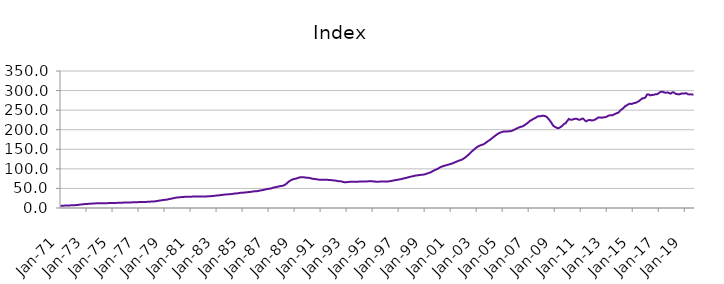
| Category | Index |
|---|---|
| 1971-01-01 | 5.879 |
| 1971-02-01 | 5.921 |
| 1971-03-01 | 5.963 |
| 1971-04-01 | 6.018 |
| 1971-05-01 | 6.108 |
| 1971-06-01 | 6.203 |
| 1971-07-01 | 6.32 |
| 1971-08-01 | 6.446 |
| 1971-09-01 | 6.572 |
| 1971-10-01 | 6.703 |
| 1971-11-01 | 6.844 |
| 1971-12-01 | 7.015 |
| 1972-01-01 | 7.135 |
| 1972-02-01 | 7.213 |
| 1972-03-01 | 7.39 |
| 1972-04-01 | 7.638 |
| 1972-05-01 | 7.997 |
| 1972-06-01 | 8.312 |
| 1972-07-01 | 8.674 |
| 1972-08-01 | 9.023 |
| 1972-09-01 | 9.332 |
| 1972-10-01 | 9.62 |
| 1972-11-01 | 9.887 |
| 1972-12-01 | 10.162 |
| 1973-01-01 | 10.359 |
| 1973-02-01 | 10.498 |
| 1973-03-01 | 10.658 |
| 1973-04-01 | 10.841 |
| 1973-05-01 | 11.075 |
| 1973-06-01 | 11.227 |
| 1973-07-01 | 11.386 |
| 1973-08-01 | 11.562 |
| 1973-09-01 | 11.768 |
| 1973-10-01 | 11.982 |
| 1973-11-01 | 12.145 |
| 1973-12-01 | 12.262 |
| 1974-01-01 | 12.324 |
| 1974-02-01 | 12.392 |
| 1974-03-01 | 12.389 |
| 1974-04-01 | 12.362 |
| 1974-05-01 | 12.339 |
| 1974-06-01 | 12.34 |
| 1974-07-01 | 12.352 |
| 1974-08-01 | 12.392 |
| 1974-09-01 | 12.465 |
| 1974-10-01 | 12.555 |
| 1974-11-01 | 12.63 |
| 1974-12-01 | 12.703 |
| 1975-01-01 | 12.737 |
| 1975-02-01 | 12.78 |
| 1975-03-01 | 12.857 |
| 1975-04-01 | 12.965 |
| 1975-05-01 | 13.097 |
| 1975-06-01 | 13.168 |
| 1975-07-01 | 13.237 |
| 1975-08-01 | 13.332 |
| 1975-09-01 | 13.462 |
| 1975-10-01 | 13.606 |
| 1975-11-01 | 13.732 |
| 1975-12-01 | 13.867 |
| 1976-01-01 | 13.963 |
| 1976-02-01 | 14.052 |
| 1976-03-01 | 14.114 |
| 1976-04-01 | 14.179 |
| 1976-05-01 | 14.264 |
| 1976-06-01 | 14.32 |
| 1976-07-01 | 14.382 |
| 1976-08-01 | 14.474 |
| 1976-09-01 | 14.605 |
| 1976-10-01 | 14.752 |
| 1976-11-01 | 14.87 |
| 1976-12-01 | 14.976 |
| 1977-01-01 | 15.034 |
| 1977-02-01 | 15.102 |
| 1977-03-01 | 15.145 |
| 1977-04-01 | 15.197 |
| 1977-05-01 | 15.276 |
| 1977-06-01 | 15.347 |
| 1977-07-01 | 15.436 |
| 1977-08-01 | 15.557 |
| 1977-09-01 | 15.705 |
| 1977-10-01 | 15.871 |
| 1977-11-01 | 16.048 |
| 1977-12-01 | 16.278 |
| 1978-01-01 | 16.449 |
| 1978-02-01 | 16.582 |
| 1978-03-01 | 16.762 |
| 1978-04-01 | 17.003 |
| 1978-05-01 | 17.391 |
| 1978-06-01 | 17.783 |
| 1978-07-01 | 18.258 |
| 1978-08-01 | 18.744 |
| 1978-09-01 | 19.213 |
| 1978-10-01 | 19.678 |
| 1978-11-01 | 20.113 |
| 1978-12-01 | 20.542 |
| 1979-01-01 | 20.797 |
| 1979-02-01 | 20.968 |
| 1979-03-01 | 21.394 |
| 1979-04-01 | 21.979 |
| 1979-05-01 | 22.725 |
| 1979-06-01 | 23.198 |
| 1979-07-01 | 23.69 |
| 1979-08-01 | 24.243 |
| 1979-09-01 | 24.906 |
| 1979-10-01 | 25.613 |
| 1979-11-01 | 26.202 |
| 1979-12-01 | 26.66 |
| 1980-01-01 | 26.911 |
| 1980-02-01 | 27.107 |
| 1980-03-01 | 27.357 |
| 1980-04-01 | 27.651 |
| 1980-05-01 | 27.994 |
| 1980-06-01 | 28.178 |
| 1980-07-01 | 28.344 |
| 1980-08-01 | 28.498 |
| 1980-09-01 | 28.607 |
| 1980-10-01 | 28.676 |
| 1980-11-01 | 28.73 |
| 1980-12-01 | 28.843 |
| 1981-01-01 | 28.911 |
| 1981-02-01 | 29.013 |
| 1981-03-01 | 29.116 |
| 1981-04-01 | 29.254 |
| 1981-05-01 | 29.394 |
| 1981-06-01 | 29.441 |
| 1981-07-01 | 29.464 |
| 1981-08-01 | 29.469 |
| 1981-09-01 | 29.414 |
| 1981-10-01 | 29.312 |
| 1981-11-01 | 29.219 |
| 1981-12-01 | 29.209 |
| 1982-01-01 | 29.164 |
| 1982-02-01 | 29.184 |
| 1982-03-01 | 29.346 |
| 1982-04-01 | 29.618 |
| 1982-05-01 | 29.924 |
| 1982-06-01 | 30.035 |
| 1982-07-01 | 30.119 |
| 1982-08-01 | 30.28 |
| 1982-09-01 | 30.54 |
| 1982-10-01 | 30.849 |
| 1982-11-01 | 31.157 |
| 1982-12-01 | 31.538 |
| 1983-01-01 | 31.828 |
| 1983-02-01 | 32.078 |
| 1983-03-01 | 32.337 |
| 1983-04-01 | 32.659 |
| 1983-05-01 | 33.081 |
| 1983-06-01 | 33.413 |
| 1983-07-01 | 33.773 |
| 1983-08-01 | 34.116 |
| 1983-09-01 | 34.39 |
| 1983-10-01 | 34.614 |
| 1983-11-01 | 34.826 |
| 1983-12-01 | 35.104 |
| 1984-01-01 | 35.27 |
| 1984-02-01 | 35.438 |
| 1984-03-01 | 35.758 |
| 1984-04-01 | 36.202 |
| 1984-05-01 | 36.71 |
| 1984-06-01 | 36.936 |
| 1984-07-01 | 37.124 |
| 1984-08-01 | 37.411 |
| 1984-09-01 | 37.87 |
| 1984-10-01 | 38.4 |
| 1984-11-01 | 38.81 |
| 1984-12-01 | 39.095 |
| 1985-01-01 | 39.174 |
| 1985-02-01 | 39.283 |
| 1985-03-01 | 39.552 |
| 1985-04-01 | 39.93 |
| 1985-05-01 | 40.361 |
| 1985-06-01 | 40.527 |
| 1985-07-01 | 40.681 |
| 1985-08-01 | 40.948 |
| 1985-09-01 | 41.393 |
| 1985-10-01 | 41.902 |
| 1985-11-01 | 42.329 |
| 1985-12-01 | 42.671 |
| 1986-01-01 | 42.803 |
| 1986-02-01 | 42.939 |
| 1986-03-01 | 43.335 |
| 1986-04-01 | 43.908 |
| 1986-05-01 | 44.624 |
| 1986-06-01 | 45.057 |
| 1986-07-01 | 45.499 |
| 1986-08-01 | 46.028 |
| 1986-09-01 | 46.692 |
| 1986-10-01 | 47.409 |
| 1986-11-01 | 48.06 |
| 1986-12-01 | 48.667 |
| 1987-01-01 | 49.02 |
| 1987-02-01 | 49.311 |
| 1987-03-01 | 49.944 |
| 1987-04-01 | 50.795 |
| 1987-05-01 | 51.813 |
| 1987-06-01 | 52.387 |
| 1987-07-01 | 52.937 |
| 1987-08-01 | 53.541 |
| 1987-09-01 | 54.197 |
| 1987-10-01 | 54.877 |
| 1987-11-01 | 55.513 |
| 1987-12-01 | 56.172 |
| 1988-01-01 | 56.486 |
| 1988-02-01 | 56.756 |
| 1988-03-01 | 57.701 |
| 1988-04-01 | 59.124 |
| 1988-05-01 | 61.264 |
| 1988-06-01 | 63.424 |
| 1988-07-01 | 65.968 |
| 1988-08-01 | 68.307 |
| 1988-09-01 | 70.109 |
| 1988-10-01 | 71.604 |
| 1988-11-01 | 72.807 |
| 1988-12-01 | 73.875 |
| 1989-01-01 | 74.434 |
| 1989-02-01 | 74.906 |
| 1989-03-01 | 75.707 |
| 1989-04-01 | 76.727 |
| 1989-05-01 | 77.807 |
| 1989-06-01 | 78.279 |
| 1989-07-01 | 78.601 |
| 1989-08-01 | 78.752 |
| 1989-09-01 | 78.622 |
| 1989-10-01 | 78.258 |
| 1989-11-01 | 77.774 |
| 1989-12-01 | 77.38 |
| 1990-01-01 | 77.025 |
| 1990-02-01 | 77.011 |
| 1990-03-01 | 76.482 |
| 1990-04-01 | 75.796 |
| 1990-05-01 | 74.994 |
| 1990-06-01 | 74.611 |
| 1990-07-01 | 74.285 |
| 1990-08-01 | 73.967 |
| 1990-09-01 | 73.52 |
| 1990-10-01 | 73.009 |
| 1990-11-01 | 72.535 |
| 1990-12-01 | 72.334 |
| 1991-01-01 | 72.192 |
| 1991-02-01 | 72.268 |
| 1991-03-01 | 72.153 |
| 1991-04-01 | 72.077 |
| 1991-05-01 | 71.977 |
| 1991-06-01 | 71.933 |
| 1991-07-01 | 71.885 |
| 1991-08-01 | 71.819 |
| 1991-09-01 | 71.705 |
| 1991-10-01 | 71.501 |
| 1991-11-01 | 71.166 |
| 1991-12-01 | 70.813 |
| 1992-01-01 | 70.463 |
| 1992-02-01 | 70.409 |
| 1992-03-01 | 69.918 |
| 1992-04-01 | 69.325 |
| 1992-05-01 | 68.671 |
| 1992-06-01 | 68.457 |
| 1992-07-01 | 68.303 |
| 1992-08-01 | 67.98 |
| 1992-09-01 | 67.29 |
| 1992-10-01 | 66.434 |
| 1992-11-01 | 65.854 |
| 1992-12-01 | 65.871 |
| 1993-01-01 | 66.034 |
| 1993-02-01 | 66.322 |
| 1993-03-01 | 66.581 |
| 1993-04-01 | 66.905 |
| 1993-05-01 | 67.182 |
| 1993-06-01 | 67.213 |
| 1993-07-01 | 67.233 |
| 1993-08-01 | 67.289 |
| 1993-09-01 | 67.247 |
| 1993-10-01 | 67.126 |
| 1993-11-01 | 67.046 |
| 1993-12-01 | 67.281 |
| 1994-01-01 | 67.604 |
| 1994-02-01 | 68.006 |
| 1994-03-01 | 67.991 |
| 1994-04-01 | 67.827 |
| 1994-05-01 | 67.683 |
| 1994-06-01 | 67.696 |
| 1994-07-01 | 67.777 |
| 1994-08-01 | 67.944 |
| 1994-09-01 | 68.21 |
| 1994-10-01 | 68.532 |
| 1994-11-01 | 68.685 |
| 1994-12-01 | 68.595 |
| 1995-01-01 | 68.092 |
| 1995-02-01 | 67.66 |
| 1995-03-01 | 67.497 |
| 1995-04-01 | 67.327 |
| 1995-05-01 | 67.356 |
| 1995-06-01 | 67.213 |
| 1995-07-01 | 67.36 |
| 1995-08-01 | 67.425 |
| 1995-09-01 | 67.463 |
| 1995-10-01 | 67.439 |
| 1995-11-01 | 67.524 |
| 1995-12-01 | 67.607 |
| 1996-01-01 | 67.632 |
| 1996-02-01 | 67.59 |
| 1996-03-01 | 67.814 |
| 1996-04-01 | 68.077 |
| 1996-05-01 | 68.578 |
| 1996-06-01 | 68.945 |
| 1996-07-01 | 69.543 |
| 1996-08-01 | 70.122 |
| 1996-09-01 | 70.708 |
| 1996-10-01 | 71.134 |
| 1996-11-01 | 71.585 |
| 1996-12-01 | 72.224 |
| 1997-01-01 | 72.682 |
| 1997-02-01 | 73.17 |
| 1997-03-01 | 73.587 |
| 1997-04-01 | 74.264 |
| 1997-05-01 | 75.148 |
| 1997-06-01 | 75.819 |
| 1997-07-01 | 76.292 |
| 1997-08-01 | 77.048 |
| 1997-09-01 | 77.723 |
| 1997-10-01 | 78.598 |
| 1997-11-01 | 79.21 |
| 1997-12-01 | 79.988 |
| 1998-01-01 | 80.449 |
| 1998-02-01 | 81.141 |
| 1998-03-01 | 81.745 |
| 1998-04-01 | 82.495 |
| 1998-05-01 | 83.027 |
| 1998-06-01 | 83.355 |
| 1998-07-01 | 83.747 |
| 1998-08-01 | 84.113 |
| 1998-09-01 | 84.484 |
| 1998-10-01 | 84.731 |
| 1998-11-01 | 85.018 |
| 1998-12-01 | 85.363 |
| 1999-01-01 | 85.875 |
| 1999-02-01 | 86.896 |
| 1999-03-01 | 87.796 |
| 1999-04-01 | 88.688 |
| 1999-05-01 | 89.666 |
| 1999-06-01 | 90.701 |
| 1999-07-01 | 91.918 |
| 1999-08-01 | 93.495 |
| 1999-09-01 | 95.101 |
| 1999-10-01 | 96.577 |
| 1999-11-01 | 97.58 |
| 1999-12-01 | 98.926 |
| 2000-01-01 | 100 |
| 2000-02-01 | 101.936 |
| 2000-03-01 | 103.455 |
| 2000-04-01 | 105.075 |
| 2000-05-01 | 105.895 |
| 2000-06-01 | 106.901 |
| 2000-07-01 | 107.798 |
| 2000-08-01 | 108.633 |
| 2000-09-01 | 109.409 |
| 2000-10-01 | 110.207 |
| 2000-11-01 | 110.863 |
| 2000-12-01 | 111.699 |
| 2001-01-01 | 112.376 |
| 2001-02-01 | 113.427 |
| 2001-03-01 | 114.41 |
| 2001-04-01 | 115.617 |
| 2001-05-01 | 116.92 |
| 2001-06-01 | 118 |
| 2001-07-01 | 119.178 |
| 2001-08-01 | 120.352 |
| 2001-09-01 | 121.415 |
| 2001-10-01 | 122.129 |
| 2001-11-01 | 123.346 |
| 2001-12-01 | 124.695 |
| 2002-01-01 | 126.498 |
| 2002-02-01 | 128.249 |
| 2002-03-01 | 130.341 |
| 2002-04-01 | 132.594 |
| 2002-05-01 | 135.137 |
| 2002-06-01 | 137.714 |
| 2002-07-01 | 140.534 |
| 2002-08-01 | 143.04 |
| 2002-09-01 | 145.7 |
| 2002-10-01 | 148.191 |
| 2002-11-01 | 150.379 |
| 2002-12-01 | 152.788 |
| 2003-01-01 | 154.938 |
| 2003-02-01 | 156.702 |
| 2003-03-01 | 158.127 |
| 2003-04-01 | 159.492 |
| 2003-05-01 | 160.649 |
| 2003-06-01 | 161.58 |
| 2003-07-01 | 162.401 |
| 2003-08-01 | 164.014 |
| 2003-09-01 | 165.699 |
| 2003-10-01 | 167.901 |
| 2003-11-01 | 170.039 |
| 2003-12-01 | 171.829 |
| 2004-01-01 | 173.609 |
| 2004-02-01 | 175.589 |
| 2004-03-01 | 177.991 |
| 2004-04-01 | 180.138 |
| 2004-05-01 | 182.465 |
| 2004-06-01 | 184.54 |
| 2004-07-01 | 186.551 |
| 2004-08-01 | 188.625 |
| 2004-09-01 | 190.257 |
| 2004-10-01 | 192.019 |
| 2004-11-01 | 192.962 |
| 2004-12-01 | 193.904 |
| 2005-01-01 | 194.627 |
| 2005-02-01 | 195.72 |
| 2005-03-01 | 195.655 |
| 2005-04-01 | 195.754 |
| 2005-05-01 | 195.194 |
| 2005-06-01 | 195.793 |
| 2005-07-01 | 195.867 |
| 2005-08-01 | 196.175 |
| 2005-09-01 | 196.736 |
| 2005-10-01 | 197.938 |
| 2005-11-01 | 198.884 |
| 2005-12-01 | 200.645 |
| 2006-01-01 | 201.661 |
| 2006-02-01 | 203.374 |
| 2006-03-01 | 204.511 |
| 2006-04-01 | 205.861 |
| 2006-05-01 | 206.826 |
| 2006-06-01 | 207.511 |
| 2006-07-01 | 208.388 |
| 2006-08-01 | 209.567 |
| 2006-09-01 | 211.353 |
| 2006-10-01 | 213.443 |
| 2006-11-01 | 215.14 |
| 2006-12-01 | 217.475 |
| 2007-01-01 | 219.496 |
| 2007-02-01 | 222.231 |
| 2007-03-01 | 223.7 |
| 2007-04-01 | 225.58 |
| 2007-05-01 | 226.869 |
| 2007-06-01 | 228.812 |
| 2007-07-01 | 229.701 |
| 2007-08-01 | 231.63 |
| 2007-09-01 | 233.384 |
| 2007-10-01 | 234.664 |
| 2007-11-01 | 234.312 |
| 2007-12-01 | 234.555 |
| 2008-01-01 | 235.086 |
| 2008-02-01 | 236.026 |
| 2008-03-01 | 235.364 |
| 2008-04-01 | 234.965 |
| 2008-05-01 | 233.6 |
| 2008-06-01 | 231.702 |
| 2008-07-01 | 228.29 |
| 2008-08-01 | 225.152 |
| 2008-09-01 | 221.485 |
| 2008-10-01 | 217.485 |
| 2008-11-01 | 212.758 |
| 2008-12-01 | 209.323 |
| 2009-01-01 | 207.652 |
| 2009-02-01 | 206.212 |
| 2009-03-01 | 204.576 |
| 2009-04-01 | 203.86 |
| 2009-05-01 | 204.572 |
| 2009-06-01 | 206.247 |
| 2009-07-01 | 207.906 |
| 2009-08-01 | 210.209 |
| 2009-09-01 | 213.072 |
| 2009-10-01 | 215.548 |
| 2009-11-01 | 216.169 |
| 2009-12-01 | 220.435 |
| 2010-01-01 | 223.882 |
| 2010-02-01 | 227.544 |
| 2010-03-01 | 226.207 |
| 2010-04-01 | 225.371 |
| 2010-05-01 | 225.616 |
| 2010-06-01 | 226.496 |
| 2010-07-01 | 227.242 |
| 2010-08-01 | 228.031 |
| 2010-09-01 | 227.934 |
| 2010-10-01 | 227.086 |
| 2010-11-01 | 225.565 |
| 2010-12-01 | 225.597 |
| 2011-01-01 | 226.214 |
| 2011-02-01 | 228.039 |
| 2011-03-01 | 228.503 |
| 2011-04-01 | 226.162 |
| 2011-05-01 | 223.102 |
| 2011-06-01 | 221.419 |
| 2011-07-01 | 222.781 |
| 2011-08-01 | 224.513 |
| 2011-09-01 | 224.472 |
| 2011-10-01 | 224.841 |
| 2011-11-01 | 223.579 |
| 2011-12-01 | 223.822 |
| 2012-01-01 | 224.584 |
| 2012-02-01 | 225.473 |
| 2012-03-01 | 227.466 |
| 2012-04-01 | 228.575 |
| 2012-05-01 | 231.11 |
| 2012-06-01 | 231.251 |
| 2012-07-01 | 231.282 |
| 2012-08-01 | 230.612 |
| 2012-09-01 | 231.126 |
| 2012-10-01 | 231.503 |
| 2012-11-01 | 231.747 |
| 2012-12-01 | 232.346 |
| 2013-01-01 | 233.26 |
| 2013-02-01 | 235.199 |
| 2013-03-01 | 236.287 |
| 2013-04-01 | 236.897 |
| 2013-05-01 | 236.822 |
| 2013-06-01 | 237.016 |
| 2013-07-01 | 237.888 |
| 2013-08-01 | 239.493 |
| 2013-09-01 | 240.786 |
| 2013-10-01 | 242.115 |
| 2013-11-01 | 242.898 |
| 2013-12-01 | 244.057 |
| 2014-01-01 | 247.816 |
| 2014-02-01 | 250.169 |
| 2014-03-01 | 252.769 |
| 2014-04-01 | 254.326 |
| 2014-05-01 | 257.246 |
| 2014-06-01 | 260.069 |
| 2014-07-01 | 261.53 |
| 2014-08-01 | 263.472 |
| 2014-09-01 | 264.905 |
| 2014-10-01 | 266.07 |
| 2014-11-01 | 266.347 |
| 2014-12-01 | 265.659 |
| 2015-01-01 | 266.928 |
| 2015-02-01 | 267.88 |
| 2015-03-01 | 268.307 |
| 2015-04-01 | 269.155 |
| 2015-05-01 | 270.34 |
| 2015-06-01 | 272.163 |
| 2015-07-01 | 273.277 |
| 2015-08-01 | 276.288 |
| 2015-09-01 | 278.116 |
| 2015-10-01 | 280.486 |
| 2015-11-01 | 280.294 |
| 2015-12-01 | 281.199 |
| 2016-01-01 | 283.607 |
| 2016-02-01 | 289.619 |
| 2016-03-01 | 290.057 |
| 2016-04-01 | 289.886 |
| 2016-05-01 | 287.681 |
| 2016-06-01 | 288.483 |
| 2016-07-01 | 288.661 |
| 2016-08-01 | 289.259 |
| 2016-09-01 | 289.711 |
| 2016-10-01 | 290.701 |
| 2016-11-01 | 290.463 |
| 2016-12-01 | 291.375 |
| 2017-01-01 | 293.717 |
| 2017-02-01 | 295.456 |
| 2017-03-01 | 297.078 |
| 2017-04-01 | 296.912 |
| 2017-05-01 | 296.553 |
| 2017-06-01 | 295.078 |
| 2017-07-01 | 294.677 |
| 2017-08-01 | 294.669 |
| 2017-09-01 | 295.305 |
| 2017-10-01 | 294.345 |
| 2017-11-01 | 293.162 |
| 2017-12-01 | 292.069 |
| 2018-01-01 | 294.449 |
| 2018-02-01 | 295.846 |
| 2018-03-01 | 294.92 |
| 2018-04-01 | 292.924 |
| 2018-05-01 | 291.472 |
| 2018-06-01 | 291.002 |
| 2018-07-01 | 290.236 |
| 2018-08-01 | 290.758 |
| 2018-09-01 | 291.058 |
| 2018-10-01 | 292.824 |
| 2018-11-01 | 292.65 |
| 2018-12-01 | 292.367 |
| 2019-01-01 | 292.491 |
| 2019-02-01 | 293.696 |
| 2019-03-01 | 292.161 |
| 2019-04-01 | 290.676 |
| 2019-05-01 | 290.217 |
| 2019-06-01 | 290.287 |
| 2019-07-01 | 290.273 |
| 2019-08-01 | 289.84 |
| 2019-09-01 | 289.95 |